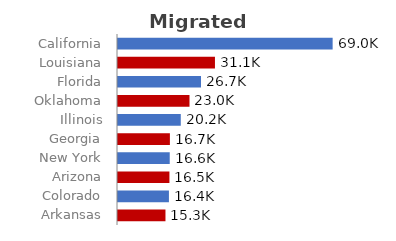
| Category | Republican | Democrat |
|---|---|---|
| Arkansas | 15.251 | 0 |
| Colorado | 0 | 16.361 |
| Arizona | 16.521 | 0 |
| New York | 0 | 16.624 |
| Georgia | 16.671 | 0 |
| Illinois | 0 | 20.169 |
| Oklahoma | 22.969 | 0 |
| Florida | 0 | 26.668 |
| Louisiana | 31.149 | 0 |
| California | 0 | 68.959 |